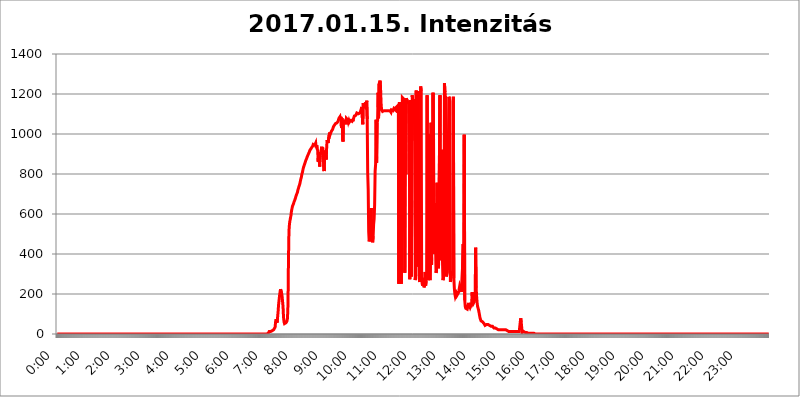
| Category | 2017.01.15. Intenzitás [W/m^2] |
|---|---|
| 0.0 | 0 |
| 0.0006944444444444445 | 0 |
| 0.001388888888888889 | 0 |
| 0.0020833333333333333 | 0 |
| 0.002777777777777778 | 0 |
| 0.003472222222222222 | 0 |
| 0.004166666666666667 | 0 |
| 0.004861111111111111 | 0 |
| 0.005555555555555556 | 0 |
| 0.0062499999999999995 | 0 |
| 0.006944444444444444 | 0 |
| 0.007638888888888889 | 0 |
| 0.008333333333333333 | 0 |
| 0.009027777777777779 | 0 |
| 0.009722222222222222 | 0 |
| 0.010416666666666666 | 0 |
| 0.011111111111111112 | 0 |
| 0.011805555555555555 | 0 |
| 0.012499999999999999 | 0 |
| 0.013194444444444444 | 0 |
| 0.013888888888888888 | 0 |
| 0.014583333333333332 | 0 |
| 0.015277777777777777 | 0 |
| 0.015972222222222224 | 0 |
| 0.016666666666666666 | 0 |
| 0.017361111111111112 | 0 |
| 0.018055555555555557 | 0 |
| 0.01875 | 0 |
| 0.019444444444444445 | 0 |
| 0.02013888888888889 | 0 |
| 0.020833333333333332 | 0 |
| 0.02152777777777778 | 0 |
| 0.022222222222222223 | 0 |
| 0.02291666666666667 | 0 |
| 0.02361111111111111 | 0 |
| 0.024305555555555556 | 0 |
| 0.024999999999999998 | 0 |
| 0.025694444444444447 | 0 |
| 0.02638888888888889 | 0 |
| 0.027083333333333334 | 0 |
| 0.027777777777777776 | 0 |
| 0.02847222222222222 | 0 |
| 0.029166666666666664 | 0 |
| 0.029861111111111113 | 0 |
| 0.030555555555555555 | 0 |
| 0.03125 | 0 |
| 0.03194444444444445 | 0 |
| 0.03263888888888889 | 0 |
| 0.03333333333333333 | 0 |
| 0.034027777777777775 | 0 |
| 0.034722222222222224 | 0 |
| 0.035416666666666666 | 0 |
| 0.036111111111111115 | 0 |
| 0.03680555555555556 | 0 |
| 0.0375 | 0 |
| 0.03819444444444444 | 0 |
| 0.03888888888888889 | 0 |
| 0.03958333333333333 | 0 |
| 0.04027777777777778 | 0 |
| 0.04097222222222222 | 0 |
| 0.041666666666666664 | 0 |
| 0.042361111111111106 | 0 |
| 0.04305555555555556 | 0 |
| 0.043750000000000004 | 0 |
| 0.044444444444444446 | 0 |
| 0.04513888888888889 | 0 |
| 0.04583333333333334 | 0 |
| 0.04652777777777778 | 0 |
| 0.04722222222222222 | 0 |
| 0.04791666666666666 | 0 |
| 0.04861111111111111 | 0 |
| 0.049305555555555554 | 0 |
| 0.049999999999999996 | 0 |
| 0.05069444444444445 | 0 |
| 0.051388888888888894 | 0 |
| 0.052083333333333336 | 0 |
| 0.05277777777777778 | 0 |
| 0.05347222222222222 | 0 |
| 0.05416666666666667 | 0 |
| 0.05486111111111111 | 0 |
| 0.05555555555555555 | 0 |
| 0.05625 | 0 |
| 0.05694444444444444 | 0 |
| 0.057638888888888885 | 0 |
| 0.05833333333333333 | 0 |
| 0.05902777777777778 | 0 |
| 0.059722222222222225 | 0 |
| 0.06041666666666667 | 0 |
| 0.061111111111111116 | 0 |
| 0.06180555555555556 | 0 |
| 0.0625 | 0 |
| 0.06319444444444444 | 0 |
| 0.06388888888888888 | 0 |
| 0.06458333333333334 | 0 |
| 0.06527777777777778 | 0 |
| 0.06597222222222222 | 0 |
| 0.06666666666666667 | 0 |
| 0.06736111111111111 | 0 |
| 0.06805555555555555 | 0 |
| 0.06874999999999999 | 0 |
| 0.06944444444444443 | 0 |
| 0.07013888888888889 | 0 |
| 0.07083333333333333 | 0 |
| 0.07152777777777779 | 0 |
| 0.07222222222222223 | 0 |
| 0.07291666666666667 | 0 |
| 0.07361111111111111 | 0 |
| 0.07430555555555556 | 0 |
| 0.075 | 0 |
| 0.07569444444444444 | 0 |
| 0.0763888888888889 | 0 |
| 0.07708333333333334 | 0 |
| 0.07777777777777778 | 0 |
| 0.07847222222222222 | 0 |
| 0.07916666666666666 | 0 |
| 0.0798611111111111 | 0 |
| 0.08055555555555556 | 0 |
| 0.08125 | 0 |
| 0.08194444444444444 | 0 |
| 0.08263888888888889 | 0 |
| 0.08333333333333333 | 0 |
| 0.08402777777777777 | 0 |
| 0.08472222222222221 | 0 |
| 0.08541666666666665 | 0 |
| 0.08611111111111112 | 0 |
| 0.08680555555555557 | 0 |
| 0.08750000000000001 | 0 |
| 0.08819444444444445 | 0 |
| 0.08888888888888889 | 0 |
| 0.08958333333333333 | 0 |
| 0.09027777777777778 | 0 |
| 0.09097222222222222 | 0 |
| 0.09166666666666667 | 0 |
| 0.09236111111111112 | 0 |
| 0.09305555555555556 | 0 |
| 0.09375 | 0 |
| 0.09444444444444444 | 0 |
| 0.09513888888888888 | 0 |
| 0.09583333333333333 | 0 |
| 0.09652777777777777 | 0 |
| 0.09722222222222222 | 0 |
| 0.09791666666666667 | 0 |
| 0.09861111111111111 | 0 |
| 0.09930555555555555 | 0 |
| 0.09999999999999999 | 0 |
| 0.10069444444444443 | 0 |
| 0.1013888888888889 | 0 |
| 0.10208333333333335 | 0 |
| 0.10277777777777779 | 0 |
| 0.10347222222222223 | 0 |
| 0.10416666666666667 | 0 |
| 0.10486111111111111 | 0 |
| 0.10555555555555556 | 0 |
| 0.10625 | 0 |
| 0.10694444444444444 | 0 |
| 0.1076388888888889 | 0 |
| 0.10833333333333334 | 0 |
| 0.10902777777777778 | 0 |
| 0.10972222222222222 | 0 |
| 0.1111111111111111 | 0 |
| 0.11180555555555556 | 0 |
| 0.11180555555555556 | 0 |
| 0.1125 | 0 |
| 0.11319444444444444 | 0 |
| 0.11388888888888889 | 0 |
| 0.11458333333333333 | 0 |
| 0.11527777777777777 | 0 |
| 0.11597222222222221 | 0 |
| 0.11666666666666665 | 0 |
| 0.1173611111111111 | 0 |
| 0.11805555555555557 | 0 |
| 0.11944444444444445 | 0 |
| 0.12013888888888889 | 0 |
| 0.12083333333333333 | 0 |
| 0.12152777777777778 | 0 |
| 0.12222222222222223 | 0 |
| 0.12291666666666667 | 0 |
| 0.12291666666666667 | 0 |
| 0.12361111111111112 | 0 |
| 0.12430555555555556 | 0 |
| 0.125 | 0 |
| 0.12569444444444444 | 0 |
| 0.12638888888888888 | 0 |
| 0.12708333333333333 | 0 |
| 0.16875 | 0 |
| 0.12847222222222224 | 0 |
| 0.12916666666666668 | 0 |
| 0.12986111111111112 | 0 |
| 0.13055555555555556 | 0 |
| 0.13125 | 0 |
| 0.13194444444444445 | 0 |
| 0.1326388888888889 | 0 |
| 0.13333333333333333 | 0 |
| 0.13402777777777777 | 0 |
| 0.13402777777777777 | 0 |
| 0.13472222222222222 | 0 |
| 0.13541666666666666 | 0 |
| 0.1361111111111111 | 0 |
| 0.13749999999999998 | 0 |
| 0.13819444444444443 | 0 |
| 0.1388888888888889 | 0 |
| 0.13958333333333334 | 0 |
| 0.14027777777777778 | 0 |
| 0.14097222222222222 | 0 |
| 0.14166666666666666 | 0 |
| 0.1423611111111111 | 0 |
| 0.14305555555555557 | 0 |
| 0.14375000000000002 | 0 |
| 0.14444444444444446 | 0 |
| 0.1451388888888889 | 0 |
| 0.1451388888888889 | 0 |
| 0.14652777777777778 | 0 |
| 0.14722222222222223 | 0 |
| 0.14791666666666667 | 0 |
| 0.1486111111111111 | 0 |
| 0.14930555555555555 | 0 |
| 0.15 | 0 |
| 0.15069444444444444 | 0 |
| 0.15138888888888888 | 0 |
| 0.15208333333333332 | 0 |
| 0.15277777777777776 | 0 |
| 0.15347222222222223 | 0 |
| 0.15416666666666667 | 0 |
| 0.15486111111111112 | 0 |
| 0.15555555555555556 | 0 |
| 0.15625 | 0 |
| 0.15694444444444444 | 0 |
| 0.15763888888888888 | 0 |
| 0.15833333333333333 | 0 |
| 0.15902777777777777 | 0 |
| 0.15972222222222224 | 0 |
| 0.16041666666666668 | 0 |
| 0.16111111111111112 | 0 |
| 0.16180555555555556 | 0 |
| 0.1625 | 0 |
| 0.16319444444444445 | 0 |
| 0.1638888888888889 | 0 |
| 0.16458333333333333 | 0 |
| 0.16527777777777777 | 0 |
| 0.16597222222222222 | 0 |
| 0.16666666666666666 | 0 |
| 0.1673611111111111 | 0 |
| 0.16805555555555554 | 0 |
| 0.16874999999999998 | 0 |
| 0.16944444444444443 | 0 |
| 0.17013888888888887 | 0 |
| 0.1708333333333333 | 0 |
| 0.17152777777777775 | 0 |
| 0.17222222222222225 | 0 |
| 0.1729166666666667 | 0 |
| 0.17361111111111113 | 0 |
| 0.17430555555555557 | 0 |
| 0.17500000000000002 | 0 |
| 0.17569444444444446 | 0 |
| 0.1763888888888889 | 0 |
| 0.17708333333333334 | 0 |
| 0.17777777777777778 | 0 |
| 0.17847222222222223 | 0 |
| 0.17916666666666667 | 0 |
| 0.1798611111111111 | 0 |
| 0.18055555555555555 | 0 |
| 0.18125 | 0 |
| 0.18194444444444444 | 0 |
| 0.1826388888888889 | 0 |
| 0.18333333333333335 | 0 |
| 0.1840277777777778 | 0 |
| 0.18472222222222223 | 0 |
| 0.18541666666666667 | 0 |
| 0.18611111111111112 | 0 |
| 0.18680555555555556 | 0 |
| 0.1875 | 0 |
| 0.18819444444444444 | 0 |
| 0.18888888888888888 | 0 |
| 0.18958333333333333 | 0 |
| 0.19027777777777777 | 0 |
| 0.1909722222222222 | 0 |
| 0.19166666666666665 | 0 |
| 0.19236111111111112 | 0 |
| 0.19305555555555554 | 0 |
| 0.19375 | 0 |
| 0.19444444444444445 | 0 |
| 0.1951388888888889 | 0 |
| 0.19583333333333333 | 0 |
| 0.19652777777777777 | 0 |
| 0.19722222222222222 | 0 |
| 0.19791666666666666 | 0 |
| 0.1986111111111111 | 0 |
| 0.19930555555555554 | 0 |
| 0.19999999999999998 | 0 |
| 0.20069444444444443 | 0 |
| 0.20138888888888887 | 0 |
| 0.2020833333333333 | 0 |
| 0.2027777777777778 | 0 |
| 0.2034722222222222 | 0 |
| 0.2041666666666667 | 0 |
| 0.20486111111111113 | 0 |
| 0.20555555555555557 | 0 |
| 0.20625000000000002 | 0 |
| 0.20694444444444446 | 0 |
| 0.2076388888888889 | 0 |
| 0.20833333333333334 | 0 |
| 0.20902777777777778 | 0 |
| 0.20972222222222223 | 0 |
| 0.21041666666666667 | 0 |
| 0.2111111111111111 | 0 |
| 0.21180555555555555 | 0 |
| 0.2125 | 0 |
| 0.21319444444444444 | 0 |
| 0.2138888888888889 | 0 |
| 0.21458333333333335 | 0 |
| 0.2152777777777778 | 0 |
| 0.21597222222222223 | 0 |
| 0.21666666666666667 | 0 |
| 0.21736111111111112 | 0 |
| 0.21805555555555556 | 0 |
| 0.21875 | 0 |
| 0.21944444444444444 | 0 |
| 0.22013888888888888 | 0 |
| 0.22083333333333333 | 0 |
| 0.22152777777777777 | 0 |
| 0.2222222222222222 | 0 |
| 0.22291666666666665 | 0 |
| 0.2236111111111111 | 0 |
| 0.22430555555555556 | 0 |
| 0.225 | 0 |
| 0.22569444444444445 | 0 |
| 0.2263888888888889 | 0 |
| 0.22708333333333333 | 0 |
| 0.22777777777777777 | 0 |
| 0.22847222222222222 | 0 |
| 0.22916666666666666 | 0 |
| 0.2298611111111111 | 0 |
| 0.23055555555555554 | 0 |
| 0.23124999999999998 | 0 |
| 0.23194444444444443 | 0 |
| 0.23263888888888887 | 0 |
| 0.2333333333333333 | 0 |
| 0.2340277777777778 | 0 |
| 0.2347222222222222 | 0 |
| 0.2354166666666667 | 0 |
| 0.23611111111111113 | 0 |
| 0.23680555555555557 | 0 |
| 0.23750000000000002 | 0 |
| 0.23819444444444446 | 0 |
| 0.2388888888888889 | 0 |
| 0.23958333333333334 | 0 |
| 0.24027777777777778 | 0 |
| 0.24097222222222223 | 0 |
| 0.24166666666666667 | 0 |
| 0.2423611111111111 | 0 |
| 0.24305555555555555 | 0 |
| 0.24375 | 0 |
| 0.24444444444444446 | 0 |
| 0.24513888888888888 | 0 |
| 0.24583333333333335 | 0 |
| 0.2465277777777778 | 0 |
| 0.24722222222222223 | 0 |
| 0.24791666666666667 | 0 |
| 0.24861111111111112 | 0 |
| 0.24930555555555556 | 0 |
| 0.25 | 0 |
| 0.25069444444444444 | 0 |
| 0.2513888888888889 | 0 |
| 0.2520833333333333 | 0 |
| 0.25277777777777777 | 0 |
| 0.2534722222222222 | 0 |
| 0.25416666666666665 | 0 |
| 0.2548611111111111 | 0 |
| 0.2555555555555556 | 0 |
| 0.25625000000000003 | 0 |
| 0.2569444444444445 | 0 |
| 0.2576388888888889 | 0 |
| 0.25833333333333336 | 0 |
| 0.2590277777777778 | 0 |
| 0.25972222222222224 | 0 |
| 0.2604166666666667 | 0 |
| 0.2611111111111111 | 0 |
| 0.26180555555555557 | 0 |
| 0.2625 | 0 |
| 0.26319444444444445 | 0 |
| 0.2638888888888889 | 0 |
| 0.26458333333333334 | 0 |
| 0.2652777777777778 | 0 |
| 0.2659722222222222 | 0 |
| 0.26666666666666666 | 0 |
| 0.2673611111111111 | 0 |
| 0.26805555555555555 | 0 |
| 0.26875 | 0 |
| 0.26944444444444443 | 0 |
| 0.2701388888888889 | 0 |
| 0.2708333333333333 | 0 |
| 0.27152777777777776 | 0 |
| 0.2722222222222222 | 0 |
| 0.27291666666666664 | 0 |
| 0.2736111111111111 | 0 |
| 0.2743055555555555 | 0 |
| 0.27499999999999997 | 0 |
| 0.27569444444444446 | 0 |
| 0.27638888888888885 | 0 |
| 0.27708333333333335 | 0 |
| 0.2777777777777778 | 0 |
| 0.27847222222222223 | 0 |
| 0.2791666666666667 | 0 |
| 0.2798611111111111 | 0 |
| 0.28055555555555556 | 0 |
| 0.28125 | 0 |
| 0.28194444444444444 | 0 |
| 0.2826388888888889 | 0 |
| 0.2833333333333333 | 0 |
| 0.28402777777777777 | 0 |
| 0.2847222222222222 | 0 |
| 0.28541666666666665 | 0 |
| 0.28611111111111115 | 0 |
| 0.28680555555555554 | 0 |
| 0.28750000000000003 | 0 |
| 0.2881944444444445 | 0 |
| 0.2888888888888889 | 0 |
| 0.28958333333333336 | 0 |
| 0.2902777777777778 | 0 |
| 0.29097222222222224 | 0 |
| 0.2916666666666667 | 0 |
| 0.2923611111111111 | 0 |
| 0.29305555555555557 | 0 |
| 0.29375 | 0 |
| 0.29444444444444445 | 3.525 |
| 0.2951388888888889 | 3.525 |
| 0.29583333333333334 | 3.525 |
| 0.2965277777777778 | 7.887 |
| 0.2972222222222222 | 12.257 |
| 0.29791666666666666 | 12.257 |
| 0.2986111111111111 | 12.257 |
| 0.29930555555555555 | 12.257 |
| 0.3 | 16.636 |
| 0.30069444444444443 | 16.636 |
| 0.3013888888888889 | 16.636 |
| 0.3020833333333333 | 21.024 |
| 0.30277777777777776 | 21.024 |
| 0.3034722222222222 | 21.024 |
| 0.30416666666666664 | 21.024 |
| 0.3048611111111111 | 21.024 |
| 0.3055555555555555 | 34.234 |
| 0.30624999999999997 | 60.85 |
| 0.3069444444444444 | 74.246 |
| 0.3076388888888889 | 65.31 |
| 0.30833333333333335 | 56.398 |
| 0.3090277777777778 | 83.205 |
| 0.30972222222222223 | 110.201 |
| 0.3104166666666667 | 146.423 |
| 0.3111111111111111 | 169.156 |
| 0.31180555555555556 | 191.937 |
| 0.3125 | 210.182 |
| 0.31319444444444444 | 223.873 |
| 0.3138888888888889 | 219.309 |
| 0.3145833333333333 | 205.62 |
| 0.31527777777777777 | 191.937 |
| 0.3159722222222222 | 196.497 |
| 0.31666666666666665 | 137.347 |
| 0.31736111111111115 | 83.205 |
| 0.31805555555555554 | 60.85 |
| 0.31875000000000003 | 51.951 |
| 0.3194444444444445 | 51.951 |
| 0.3201388888888889 | 51.951 |
| 0.32083333333333336 | 56.398 |
| 0.3215277777777778 | 60.85 |
| 0.32222222222222224 | 65.31 |
| 0.3229166666666667 | 78.722 |
| 0.3236111111111111 | 146.423 |
| 0.32430555555555557 | 373.729 |
| 0.325 | 515.223 |
| 0.32569444444444445 | 549.704 |
| 0.3263888888888889 | 566.793 |
| 0.32708333333333334 | 579.542 |
| 0.3277777777777778 | 592.233 |
| 0.3284722222222222 | 613.252 |
| 0.32916666666666666 | 625.784 |
| 0.3298611111111111 | 638.256 |
| 0.33055555555555555 | 642.4 |
| 0.33125 | 650.667 |
| 0.33194444444444443 | 658.909 |
| 0.3326388888888889 | 663.019 |
| 0.3333333333333333 | 671.22 |
| 0.3340277777777778 | 679.395 |
| 0.3347222222222222 | 687.544 |
| 0.3354166666666667 | 695.666 |
| 0.3361111111111111 | 699.717 |
| 0.3368055555555556 | 707.8 |
| 0.33749999999999997 | 719.877 |
| 0.33819444444444446 | 727.896 |
| 0.33888888888888885 | 735.89 |
| 0.33958333333333335 | 739.877 |
| 0.34027777777777773 | 751.803 |
| 0.34097222222222223 | 763.674 |
| 0.3416666666666666 | 775.492 |
| 0.3423611111111111 | 783.342 |
| 0.3430555555555555 | 798.974 |
| 0.34375 | 806.757 |
| 0.3444444444444445 | 818.392 |
| 0.3451388888888889 | 829.981 |
| 0.3458333333333334 | 837.682 |
| 0.34652777777777777 | 845.365 |
| 0.34722222222222227 | 853.029 |
| 0.34791666666666665 | 860.676 |
| 0.34861111111111115 | 868.305 |
| 0.34930555555555554 | 872.114 |
| 0.35000000000000003 | 879.719 |
| 0.3506944444444444 | 887.309 |
| 0.3513888888888889 | 891.099 |
| 0.3520833333333333 | 898.668 |
| 0.3527777777777778 | 902.447 |
| 0.3534722222222222 | 909.996 |
| 0.3541666666666667 | 917.534 |
| 0.3548611111111111 | 921.298 |
| 0.35555555555555557 | 925.06 |
| 0.35625 | 925.06 |
| 0.35694444444444445 | 932.576 |
| 0.3576388888888889 | 936.33 |
| 0.35833333333333334 | 940.082 |
| 0.3590277777777778 | 947.58 |
| 0.3597222222222222 | 943.832 |
| 0.36041666666666666 | 951.327 |
| 0.3611111111111111 | 943.832 |
| 0.36180555555555555 | 940.082 |
| 0.3625 | 955.071 |
| 0.36319444444444443 | 932.576 |
| 0.3638888888888889 | 943.832 |
| 0.3645833333333333 | 925.06 |
| 0.3652777777777778 | 917.534 |
| 0.3659722222222222 | 860.676 |
| 0.3666666666666667 | 909.996 |
| 0.3673611111111111 | 913.766 |
| 0.3680555555555556 | 837.682 |
| 0.36874999999999997 | 891.099 |
| 0.36944444444444446 | 887.309 |
| 0.37013888888888885 | 917.534 |
| 0.37083333333333335 | 936.33 |
| 0.37152777777777773 | 909.996 |
| 0.37222222222222223 | 932.576 |
| 0.3729166666666666 | 932.576 |
| 0.3736111111111111 | 932.576 |
| 0.3743055555555555 | 814.519 |
| 0.375 | 887.309 |
| 0.3756944444444445 | 894.885 |
| 0.3763888888888889 | 917.534 |
| 0.3770833333333334 | 872.114 |
| 0.37777777777777777 | 925.06 |
| 0.37847222222222227 | 970.034 |
| 0.37916666666666665 | 966.295 |
| 0.37986111111111115 | 955.071 |
| 0.38055555555555554 | 958.814 |
| 0.38125000000000003 | 992.448 |
| 0.3819444444444444 | 1007.383 |
| 0.3826388888888889 | 996.182 |
| 0.3833333333333333 | 1003.65 |
| 0.3840277777777778 | 1007.383 |
| 0.3847222222222222 | 1014.852 |
| 0.3854166666666667 | 1014.852 |
| 0.3861111111111111 | 1022.323 |
| 0.38680555555555557 | 1029.798 |
| 0.3875 | 1037.277 |
| 0.38819444444444445 | 1041.019 |
| 0.3888888888888889 | 1044.762 |
| 0.38958333333333334 | 1041.019 |
| 0.3902777777777778 | 1052.255 |
| 0.3909722222222222 | 1052.255 |
| 0.39166666666666666 | 1052.255 |
| 0.3923611111111111 | 1056.004 |
| 0.39305555555555555 | 1059.756 |
| 0.39375 | 1063.51 |
| 0.39444444444444443 | 1071.027 |
| 0.3951388888888889 | 1078.555 |
| 0.3958333333333333 | 1078.555 |
| 0.3965277777777778 | 1086.097 |
| 0.3972222222222222 | 1071.027 |
| 0.3979166666666667 | 1086.097 |
| 0.3986111111111111 | 1029.798 |
| 0.3993055555555556 | 1078.555 |
| 0.39999999999999997 | 1078.555 |
| 0.40069444444444446 | 962.555 |
| 0.40138888888888885 | 1063.51 |
| 0.40208333333333335 | 1059.756 |
| 0.40277777777777773 | 1059.756 |
| 0.40347222222222223 | 1063.51 |
| 0.4041666666666666 | 1071.027 |
| 0.4048611111111111 | 1048.508 |
| 0.4055555555555555 | 1078.555 |
| 0.40625 | 1074.789 |
| 0.4069444444444445 | 1074.789 |
| 0.4076388888888889 | 1071.027 |
| 0.4083333333333334 | 1059.756 |
| 0.40902777777777777 | 1067.267 |
| 0.40972222222222227 | 1059.756 |
| 0.41041666666666665 | 1056.004 |
| 0.41111111111111115 | 1067.267 |
| 0.41180555555555554 | 1067.267 |
| 0.41250000000000003 | 1071.027 |
| 0.4131944444444444 | 1063.51 |
| 0.4138888888888889 | 1074.789 |
| 0.4145833333333333 | 1063.51 |
| 0.4152777777777778 | 1074.789 |
| 0.4159722222222222 | 1078.555 |
| 0.4166666666666667 | 1089.873 |
| 0.4173611111111111 | 1093.653 |
| 0.41805555555555557 | 1089.873 |
| 0.41875 | 1093.653 |
| 0.41944444444444445 | 1093.653 |
| 0.4201388888888889 | 1105.019 |
| 0.42083333333333334 | 1101.226 |
| 0.4215277777777778 | 1101.226 |
| 0.4222222222222222 | 1101.226 |
| 0.42291666666666666 | 1101.226 |
| 0.4236111111111111 | 1101.226 |
| 0.42430555555555555 | 1105.019 |
| 0.425 | 1105.019 |
| 0.42569444444444443 | 1116.426 |
| 0.4263888888888889 | 1120.238 |
| 0.4270833333333333 | 1135.543 |
| 0.4277777777777778 | 1139.384 |
| 0.4284722222222222 | 1048.508 |
| 0.4291666666666667 | 1154.814 |
| 0.4298611111111111 | 1158.689 |
| 0.4305555555555556 | 1150.946 |
| 0.43124999999999997 | 1131.708 |
| 0.43194444444444446 | 1143.232 |
| 0.43263888888888885 | 1158.689 |
| 0.43333333333333335 | 1124.056 |
| 0.43402777777777773 | 1166.46 |
| 0.43472222222222223 | 1074.789 |
| 0.4354166666666666 | 806.757 |
| 0.4361111111111111 | 723.889 |
| 0.4368055555555555 | 510.885 |
| 0.4375 | 462.786 |
| 0.4381944444444445 | 458.38 |
| 0.4388888888888889 | 458.38 |
| 0.4395833333333334 | 493.475 |
| 0.44027777777777777 | 629.948 |
| 0.44097222222222227 | 497.836 |
| 0.44166666666666665 | 471.582 |
| 0.44236111111111115 | 458.38 |
| 0.44305555555555554 | 489.108 |
| 0.44375000000000003 | 549.704 |
| 0.4444444444444444 | 575.299 |
| 0.4451388888888889 | 646.537 |
| 0.4458333333333333 | 814.519 |
| 0.4465277777777778 | 849.199 |
| 0.4472222222222222 | 1071.027 |
| 0.4479166666666667 | 856.855 |
| 0.4486111111111111 | 1056.004 |
| 0.44930555555555557 | 1067.267 |
| 0.45 | 1205.82 |
| 0.45069444444444445 | 1078.555 |
| 0.4513888888888889 | 1250.275 |
| 0.45208333333333334 | 1258.511 |
| 0.4527777777777778 | 1266.8 |
| 0.4534722222222222 | 1225.859 |
| 0.45416666666666666 | 1154.814 |
| 0.4548611111111111 | 1120.238 |
| 0.45555555555555555 | 1116.426 |
| 0.45625 | 1112.618 |
| 0.45694444444444443 | 1116.426 |
| 0.4576388888888889 | 1116.426 |
| 0.4583333333333333 | 1116.426 |
| 0.4590277777777778 | 1116.426 |
| 0.4597222222222222 | 1116.426 |
| 0.4604166666666667 | 1116.426 |
| 0.4611111111111111 | 1116.426 |
| 0.4618055555555556 | 1116.426 |
| 0.46249999999999997 | 1116.426 |
| 0.46319444444444446 | 1112.618 |
| 0.46388888888888885 | 1116.426 |
| 0.46458333333333335 | 1116.426 |
| 0.46527777777777773 | 1112.618 |
| 0.46597222222222223 | 1120.238 |
| 0.4666666666666666 | 1116.426 |
| 0.4673611111111111 | 1116.426 |
| 0.4680555555555555 | 1108.816 |
| 0.46875 | 1120.238 |
| 0.4694444444444445 | 1124.056 |
| 0.4701388888888889 | 1116.426 |
| 0.4708333333333334 | 1116.426 |
| 0.47152777777777777 | 1120.238 |
| 0.47222222222222227 | 1127.879 |
| 0.47291666666666665 | 1124.056 |
| 0.47361111111111115 | 1124.056 |
| 0.47430555555555554 | 1120.238 |
| 0.47500000000000003 | 1131.708 |
| 0.4756944444444444 | 1127.879 |
| 0.4763888888888889 | 1131.708 |
| 0.4770833333333333 | 1139.384 |
| 0.4777777777777778 | 1105.019 |
| 0.4784722222222222 | 1135.543 |
| 0.4791666666666667 | 251.251 |
| 0.4798611111111111 | 1158.689 |
| 0.48055555555555557 | 1135.543 |
| 0.48125 | 1147.086 |
| 0.48194444444444445 | 269.49 |
| 0.4826388888888889 | 251.251 |
| 0.48333333333333334 | 695.666 |
| 0.4840277777777778 | 1182.099 |
| 0.4847222222222222 | 1182.099 |
| 0.48541666666666666 | 1182.099 |
| 0.4861111111111111 | 1174.263 |
| 0.48680555555555555 | 1033.537 |
| 0.4875 | 305.898 |
| 0.48819444444444443 | 1124.056 |
| 0.4888888888888889 | 798.974 |
| 0.4895833333333333 | 1178.177 |
| 0.4902777777777778 | 1178.177 |
| 0.4909722222222222 | 1174.263 |
| 0.4916666666666667 | 1158.689 |
| 0.4923611111111111 | 1162.571 |
| 0.4930555555555556 | 1158.689 |
| 0.49374999999999997 | 1158.689 |
| 0.49444444444444446 | 274.047 |
| 0.49513888888888885 | 699.717 |
| 0.49583333333333335 | 1170.358 |
| 0.49652777777777773 | 287.709 |
| 0.49722222222222223 | 667.123 |
| 0.4979166666666666 | 1193.918 |
| 0.4986111111111111 | 1189.969 |
| 0.4993055555555555 | 1116.426 |
| 0.5 | 1147.086 |
| 0.5006944444444444 | 1174.263 |
| 0.5013888888888889 | 966.295 |
| 0.5020833333333333 | 269.49 |
| 0.5027777777777778 | 296.808 |
| 0.5034722222222222 | 1217.812 |
| 0.5041666666666667 | 337.639 |
| 0.5048611111111111 | 431.833 |
| 0.5055555555555555 | 351.198 |
| 0.50625 | 1213.804 |
| 0.5069444444444444 | 962.555 |
| 0.5076388888888889 | 278.603 |
| 0.5083333333333333 | 260.373 |
| 0.5090277777777777 | 333.113 |
| 0.5097222222222222 | 1238.014 |
| 0.5104166666666666 | 1213.804 |
| 0.5111111111111112 | 274.047 |
| 0.5118055555555555 | 251.251 |
| 0.5125000000000001 | 242.127 |
| 0.5131944444444444 | 278.603 |
| 0.513888888888889 | 260.373 |
| 0.5145833333333333 | 233 |
| 0.5152777777777778 | 260.373 |
| 0.5159722222222222 | 310.44 |
| 0.5166666666666667 | 242.127 |
| 0.517361111111111 | 264.932 |
| 0.5180555555555556 | 292.259 |
| 0.5187499999999999 | 1193.918 |
| 0.5194444444444445 | 287.709 |
| 0.5201388888888888 | 269.49 |
| 0.5208333333333334 | 278.603 |
| 0.5215277777777778 | 999.916 |
| 0.5222222222222223 | 283.156 |
| 0.5229166666666667 | 269.49 |
| 0.5236111111111111 | 422.943 |
| 0.5243055555555556 | 1056.004 |
| 0.525 | 346.682 |
| 0.5256944444444445 | 747.834 |
| 0.5263888888888889 | 719.877 |
| 0.5270833333333333 | 1205.82 |
| 0.5277777777777778 | 970.034 |
| 0.5284722222222222 | 453.968 |
| 0.5291666666666667 | 400.638 |
| 0.5298611111111111 | 654.791 |
| 0.5305555555555556 | 449.551 |
| 0.53125 | 305.898 |
| 0.5319444444444444 | 314.98 |
| 0.5326388888888889 | 755.766 |
| 0.5333333333333333 | 342.162 |
| 0.5340277777777778 | 351.198 |
| 0.5347222222222222 | 328.584 |
| 0.5354166666666667 | 328.584 |
| 0.5361111111111111 | 333.113 |
| 0.5368055555555555 | 1193.918 |
| 0.5375 | 369.23 |
| 0.5381944444444444 | 396.164 |
| 0.5388888888888889 | 921.298 |
| 0.5395833333333333 | 405.108 |
| 0.5402777777777777 | 369.23 |
| 0.5409722222222222 | 269.49 |
| 0.5416666666666666 | 278.603 |
| 0.5423611111111112 | 328.584 |
| 0.5430555555555555 | 1254.387 |
| 0.5437500000000001 | 1209.807 |
| 0.5444444444444444 | 1189.969 |
| 0.545138888888889 | 1174.263 |
| 0.5458333333333333 | 287.709 |
| 0.5465277777777778 | 287.709 |
| 0.5472222222222222 | 314.98 |
| 0.5479166666666667 | 364.728 |
| 0.548611111111111 | 962.555 |
| 0.5493055555555556 | 1186.03 |
| 0.5499999999999999 | 1178.177 |
| 0.5506944444444445 | 1162.571 |
| 0.5513888888888888 | 260.373 |
| 0.5520833333333334 | 274.047 |
| 0.5527777777777778 | 314.98 |
| 0.5534722222222223 | 305.898 |
| 0.5541666666666667 | 292.259 |
| 0.5548611111111111 | 305.898 |
| 0.5555555555555556 | 1186.03 |
| 0.55625 | 278.603 |
| 0.5569444444444445 | 228.436 |
| 0.5576388888888889 | 201.058 |
| 0.5583333333333333 | 187.378 |
| 0.5590277777777778 | 182.82 |
| 0.5597222222222222 | 201.058 |
| 0.5604166666666667 | 191.937 |
| 0.5611111111111111 | 187.378 |
| 0.5618055555555556 | 191.937 |
| 0.5625 | 205.62 |
| 0.5631944444444444 | 214.746 |
| 0.5638888888888889 | 228.436 |
| 0.5645833333333333 | 242.127 |
| 0.5652777777777778 | 237.564 |
| 0.5659722222222222 | 228.436 |
| 0.5666666666666667 | 219.309 |
| 0.5673611111111111 | 210.182 |
| 0.5680555555555555 | 205.62 |
| 0.56875 | 210.182 |
| 0.5694444444444444 | 449.551 |
| 0.5701388888888889 | 214.746 |
| 0.5708333333333333 | 996.182 |
| 0.5715277777777777 | 169.156 |
| 0.5722222222222222 | 137.347 |
| 0.5729166666666666 | 128.284 |
| 0.5736111111111112 | 128.284 |
| 0.5743055555555555 | 128.284 |
| 0.5750000000000001 | 123.758 |
| 0.5756944444444444 | 119.235 |
| 0.576388888888889 | 119.235 |
| 0.5770833333333333 | 155.509 |
| 0.5777777777777778 | 146.423 |
| 0.5784722222222222 | 146.423 |
| 0.5791666666666667 | 132.814 |
| 0.579861111111111 | 132.814 |
| 0.5805555555555556 | 132.814 |
| 0.5812499999999999 | 150.964 |
| 0.5819444444444445 | 210.182 |
| 0.5826388888888888 | 160.056 |
| 0.5833333333333334 | 150.964 |
| 0.5840277777777778 | 150.964 |
| 0.5847222222222223 | 160.056 |
| 0.5854166666666667 | 164.605 |
| 0.5861111111111111 | 178.264 |
| 0.5868055555555556 | 431.833 |
| 0.5875 | 233 |
| 0.5881944444444445 | 187.378 |
| 0.5888888888888889 | 155.509 |
| 0.5895833333333333 | 137.347 |
| 0.5902777777777778 | 137.347 |
| 0.5909722222222222 | 119.235 |
| 0.5916666666666667 | 105.69 |
| 0.5923611111111111 | 92.184 |
| 0.5930555555555556 | 78.722 |
| 0.59375 | 74.246 |
| 0.5944444444444444 | 65.31 |
| 0.5951388888888889 | 60.85 |
| 0.5958333333333333 | 65.31 |
| 0.5965277777777778 | 60.85 |
| 0.5972222222222222 | 65.31 |
| 0.5979166666666667 | 60.85 |
| 0.5986111111111111 | 51.951 |
| 0.5993055555555555 | 47.511 |
| 0.6 | 43.079 |
| 0.6006944444444444 | 43.079 |
| 0.6013888888888889 | 43.079 |
| 0.6020833333333333 | 47.511 |
| 0.6027777777777777 | 47.511 |
| 0.6034722222222222 | 47.511 |
| 0.6041666666666666 | 47.511 |
| 0.6048611111111112 | 47.511 |
| 0.6055555555555555 | 43.079 |
| 0.6062500000000001 | 43.079 |
| 0.6069444444444444 | 43.079 |
| 0.607638888888889 | 43.079 |
| 0.6083333333333333 | 38.653 |
| 0.6090277777777778 | 38.653 |
| 0.6097222222222222 | 38.653 |
| 0.6104166666666667 | 38.653 |
| 0.611111111111111 | 34.234 |
| 0.6118055555555556 | 34.234 |
| 0.6124999999999999 | 29.823 |
| 0.6131944444444445 | 29.823 |
| 0.6138888888888888 | 29.823 |
| 0.6145833333333334 | 29.823 |
| 0.6152777777777778 | 25.419 |
| 0.6159722222222223 | 25.419 |
| 0.6166666666666667 | 25.419 |
| 0.6173611111111111 | 21.024 |
| 0.6180555555555556 | 21.024 |
| 0.61875 | 21.024 |
| 0.6194444444444445 | 21.024 |
| 0.6201388888888889 | 21.024 |
| 0.6208333333333333 | 21.024 |
| 0.6215277777777778 | 21.024 |
| 0.6222222222222222 | 21.024 |
| 0.6229166666666667 | 21.024 |
| 0.6236111111111111 | 21.024 |
| 0.6243055555555556 | 21.024 |
| 0.625 | 21.024 |
| 0.6256944444444444 | 21.024 |
| 0.6263888888888889 | 21.024 |
| 0.6270833333333333 | 21.024 |
| 0.6277777777777778 | 21.024 |
| 0.6284722222222222 | 21.024 |
| 0.6291666666666667 | 21.024 |
| 0.6298611111111111 | 16.636 |
| 0.6305555555555555 | 16.636 |
| 0.63125 | 16.636 |
| 0.6319444444444444 | 12.257 |
| 0.6326388888888889 | 12.257 |
| 0.6333333333333333 | 12.257 |
| 0.6340277777777777 | 12.257 |
| 0.6347222222222222 | 12.257 |
| 0.6354166666666666 | 12.257 |
| 0.6361111111111112 | 12.257 |
| 0.6368055555555555 | 12.257 |
| 0.6375000000000001 | 12.257 |
| 0.6381944444444444 | 12.257 |
| 0.638888888888889 | 12.257 |
| 0.6395833333333333 | 12.257 |
| 0.6402777777777778 | 12.257 |
| 0.6409722222222222 | 12.257 |
| 0.6416666666666667 | 12.257 |
| 0.642361111111111 | 12.257 |
| 0.6430555555555556 | 12.257 |
| 0.6437499999999999 | 12.257 |
| 0.6444444444444445 | 12.257 |
| 0.6451388888888888 | 12.257 |
| 0.6458333333333334 | 12.257 |
| 0.6465277777777778 | 12.257 |
| 0.6472222222222223 | 12.257 |
| 0.6479166666666667 | 12.257 |
| 0.6486111111111111 | 12.257 |
| 0.6493055555555556 | 12.257 |
| 0.65 | 78.722 |
| 0.6506944444444445 | 60.85 |
| 0.6513888888888889 | 34.234 |
| 0.6520833333333333 | 7.887 |
| 0.6527777777777778 | 12.257 |
| 0.6534722222222222 | 12.257 |
| 0.6541666666666667 | 12.257 |
| 0.6548611111111111 | 12.257 |
| 0.6555555555555556 | 12.257 |
| 0.65625 | 7.887 |
| 0.6569444444444444 | 7.887 |
| 0.6576388888888889 | 7.887 |
| 0.6583333333333333 | 7.887 |
| 0.6590277777777778 | 7.887 |
| 0.6597222222222222 | 3.525 |
| 0.6604166666666667 | 3.525 |
| 0.6611111111111111 | 3.525 |
| 0.6618055555555555 | 3.525 |
| 0.6625 | 3.525 |
| 0.6631944444444444 | 3.525 |
| 0.6638888888888889 | 3.525 |
| 0.6645833333333333 | 3.525 |
| 0.6652777777777777 | 3.525 |
| 0.6659722222222222 | 3.525 |
| 0.6666666666666666 | 3.525 |
| 0.6673611111111111 | 3.525 |
| 0.6680555555555556 | 3.525 |
| 0.6687500000000001 | 3.525 |
| 0.6694444444444444 | 3.525 |
| 0.6701388888888888 | 3.525 |
| 0.6708333333333334 | 0 |
| 0.6715277777777778 | 3.525 |
| 0.6722222222222222 | 0 |
| 0.6729166666666666 | 0 |
| 0.6736111111111112 | 0 |
| 0.6743055555555556 | 0 |
| 0.6749999999999999 | 0 |
| 0.6756944444444444 | 0 |
| 0.6763888888888889 | 0 |
| 0.6770833333333334 | 0 |
| 0.6777777777777777 | 0 |
| 0.6784722222222223 | 0 |
| 0.6791666666666667 | 0 |
| 0.6798611111111111 | 0 |
| 0.6805555555555555 | 0 |
| 0.68125 | 0 |
| 0.6819444444444445 | 0 |
| 0.6826388888888889 | 0 |
| 0.6833333333333332 | 0 |
| 0.6840277777777778 | 0 |
| 0.6847222222222222 | 0 |
| 0.6854166666666667 | 0 |
| 0.686111111111111 | 0 |
| 0.6868055555555556 | 0 |
| 0.6875 | 0 |
| 0.6881944444444444 | 0 |
| 0.688888888888889 | 0 |
| 0.6895833333333333 | 0 |
| 0.6902777777777778 | 0 |
| 0.6909722222222222 | 0 |
| 0.6916666666666668 | 0 |
| 0.6923611111111111 | 0 |
| 0.6930555555555555 | 0 |
| 0.69375 | 0 |
| 0.6944444444444445 | 0 |
| 0.6951388888888889 | 0 |
| 0.6958333333333333 | 0 |
| 0.6965277777777777 | 0 |
| 0.6972222222222223 | 0 |
| 0.6979166666666666 | 0 |
| 0.6986111111111111 | 0 |
| 0.6993055555555556 | 0 |
| 0.7000000000000001 | 0 |
| 0.7006944444444444 | 0 |
| 0.7013888888888888 | 0 |
| 0.7020833333333334 | 0 |
| 0.7027777777777778 | 0 |
| 0.7034722222222222 | 0 |
| 0.7041666666666666 | 0 |
| 0.7048611111111112 | 0 |
| 0.7055555555555556 | 0 |
| 0.7062499999999999 | 0 |
| 0.7069444444444444 | 0 |
| 0.7076388888888889 | 0 |
| 0.7083333333333334 | 0 |
| 0.7090277777777777 | 0 |
| 0.7097222222222223 | 0 |
| 0.7104166666666667 | 0 |
| 0.7111111111111111 | 0 |
| 0.7118055555555555 | 0 |
| 0.7125 | 0 |
| 0.7131944444444445 | 0 |
| 0.7138888888888889 | 0 |
| 0.7145833333333332 | 0 |
| 0.7152777777777778 | 0 |
| 0.7159722222222222 | 0 |
| 0.7166666666666667 | 0 |
| 0.717361111111111 | 0 |
| 0.7180555555555556 | 0 |
| 0.71875 | 0 |
| 0.7194444444444444 | 0 |
| 0.720138888888889 | 0 |
| 0.7208333333333333 | 0 |
| 0.7215277777777778 | 0 |
| 0.7222222222222222 | 0 |
| 0.7229166666666668 | 0 |
| 0.7236111111111111 | 0 |
| 0.7243055555555555 | 0 |
| 0.725 | 0 |
| 0.7256944444444445 | 0 |
| 0.7263888888888889 | 0 |
| 0.7270833333333333 | 0 |
| 0.7277777777777777 | 0 |
| 0.7284722222222223 | 0 |
| 0.7291666666666666 | 0 |
| 0.7298611111111111 | 0 |
| 0.7305555555555556 | 0 |
| 0.7312500000000001 | 0 |
| 0.7319444444444444 | 0 |
| 0.7326388888888888 | 0 |
| 0.7333333333333334 | 0 |
| 0.7340277777777778 | 0 |
| 0.7347222222222222 | 0 |
| 0.7354166666666666 | 0 |
| 0.7361111111111112 | 0 |
| 0.7368055555555556 | 0 |
| 0.7374999999999999 | 0 |
| 0.7381944444444444 | 0 |
| 0.7388888888888889 | 0 |
| 0.7395833333333334 | 0 |
| 0.7402777777777777 | 0 |
| 0.7409722222222223 | 0 |
| 0.7416666666666667 | 0 |
| 0.7423611111111111 | 0 |
| 0.7430555555555555 | 0 |
| 0.74375 | 0 |
| 0.7444444444444445 | 0 |
| 0.7451388888888889 | 0 |
| 0.7458333333333332 | 0 |
| 0.7465277777777778 | 0 |
| 0.7472222222222222 | 0 |
| 0.7479166666666667 | 0 |
| 0.748611111111111 | 0 |
| 0.7493055555555556 | 0 |
| 0.75 | 0 |
| 0.7506944444444444 | 0 |
| 0.751388888888889 | 0 |
| 0.7520833333333333 | 0 |
| 0.7527777777777778 | 0 |
| 0.7534722222222222 | 0 |
| 0.7541666666666668 | 0 |
| 0.7548611111111111 | 0 |
| 0.7555555555555555 | 0 |
| 0.75625 | 0 |
| 0.7569444444444445 | 0 |
| 0.7576388888888889 | 0 |
| 0.7583333333333333 | 0 |
| 0.7590277777777777 | 0 |
| 0.7597222222222223 | 0 |
| 0.7604166666666666 | 0 |
| 0.7611111111111111 | 0 |
| 0.7618055555555556 | 0 |
| 0.7625000000000001 | 0 |
| 0.7631944444444444 | 0 |
| 0.7638888888888888 | 0 |
| 0.7645833333333334 | 0 |
| 0.7652777777777778 | 0 |
| 0.7659722222222222 | 0 |
| 0.7666666666666666 | 0 |
| 0.7673611111111112 | 0 |
| 0.7680555555555556 | 0 |
| 0.7687499999999999 | 0 |
| 0.7694444444444444 | 0 |
| 0.7701388888888889 | 0 |
| 0.7708333333333334 | 0 |
| 0.7715277777777777 | 0 |
| 0.7722222222222223 | 0 |
| 0.7729166666666667 | 0 |
| 0.7736111111111111 | 0 |
| 0.7743055555555555 | 0 |
| 0.775 | 0 |
| 0.7756944444444445 | 0 |
| 0.7763888888888889 | 0 |
| 0.7770833333333332 | 0 |
| 0.7777777777777778 | 0 |
| 0.7784722222222222 | 0 |
| 0.7791666666666667 | 0 |
| 0.779861111111111 | 0 |
| 0.7805555555555556 | 0 |
| 0.78125 | 0 |
| 0.7819444444444444 | 0 |
| 0.782638888888889 | 0 |
| 0.7833333333333333 | 0 |
| 0.7840277777777778 | 0 |
| 0.7847222222222222 | 0 |
| 0.7854166666666668 | 0 |
| 0.7861111111111111 | 0 |
| 0.7868055555555555 | 0 |
| 0.7875 | 0 |
| 0.7881944444444445 | 0 |
| 0.7888888888888889 | 0 |
| 0.7895833333333333 | 0 |
| 0.7902777777777777 | 0 |
| 0.7909722222222223 | 0 |
| 0.7916666666666666 | 0 |
| 0.7923611111111111 | 0 |
| 0.7930555555555556 | 0 |
| 0.7937500000000001 | 0 |
| 0.7944444444444444 | 0 |
| 0.7951388888888888 | 0 |
| 0.7958333333333334 | 0 |
| 0.7965277777777778 | 0 |
| 0.7972222222222222 | 0 |
| 0.7979166666666666 | 0 |
| 0.7986111111111112 | 0 |
| 0.7993055555555556 | 0 |
| 0.7999999999999999 | 0 |
| 0.8006944444444444 | 0 |
| 0.8013888888888889 | 0 |
| 0.8020833333333334 | 0 |
| 0.8027777777777777 | 0 |
| 0.8034722222222223 | 0 |
| 0.8041666666666667 | 0 |
| 0.8048611111111111 | 0 |
| 0.8055555555555555 | 0 |
| 0.80625 | 0 |
| 0.8069444444444445 | 0 |
| 0.8076388888888889 | 0 |
| 0.8083333333333332 | 0 |
| 0.8090277777777778 | 0 |
| 0.8097222222222222 | 0 |
| 0.8104166666666667 | 0 |
| 0.811111111111111 | 0 |
| 0.8118055555555556 | 0 |
| 0.8125 | 0 |
| 0.8131944444444444 | 0 |
| 0.813888888888889 | 0 |
| 0.8145833333333333 | 0 |
| 0.8152777777777778 | 0 |
| 0.8159722222222222 | 0 |
| 0.8166666666666668 | 0 |
| 0.8173611111111111 | 0 |
| 0.8180555555555555 | 0 |
| 0.81875 | 0 |
| 0.8194444444444445 | 0 |
| 0.8201388888888889 | 0 |
| 0.8208333333333333 | 0 |
| 0.8215277777777777 | 0 |
| 0.8222222222222223 | 0 |
| 0.8229166666666666 | 0 |
| 0.8236111111111111 | 0 |
| 0.8243055555555556 | 0 |
| 0.8250000000000001 | 0 |
| 0.8256944444444444 | 0 |
| 0.8263888888888888 | 0 |
| 0.8270833333333334 | 0 |
| 0.8277777777777778 | 0 |
| 0.8284722222222222 | 0 |
| 0.8291666666666666 | 0 |
| 0.8298611111111112 | 0 |
| 0.8305555555555556 | 0 |
| 0.8312499999999999 | 0 |
| 0.8319444444444444 | 0 |
| 0.8326388888888889 | 0 |
| 0.8333333333333334 | 0 |
| 0.8340277777777777 | 0 |
| 0.8347222222222223 | 0 |
| 0.8354166666666667 | 0 |
| 0.8361111111111111 | 0 |
| 0.8368055555555555 | 0 |
| 0.8375 | 0 |
| 0.8381944444444445 | 0 |
| 0.8388888888888889 | 0 |
| 0.8395833333333332 | 0 |
| 0.8402777777777778 | 0 |
| 0.8409722222222222 | 0 |
| 0.8416666666666667 | 0 |
| 0.842361111111111 | 0 |
| 0.8430555555555556 | 0 |
| 0.84375 | 0 |
| 0.8444444444444444 | 0 |
| 0.845138888888889 | 0 |
| 0.8458333333333333 | 0 |
| 0.8465277777777778 | 0 |
| 0.8472222222222222 | 0 |
| 0.8479166666666668 | 0 |
| 0.8486111111111111 | 0 |
| 0.8493055555555555 | 0 |
| 0.85 | 0 |
| 0.8506944444444445 | 0 |
| 0.8513888888888889 | 0 |
| 0.8520833333333333 | 0 |
| 0.8527777777777777 | 0 |
| 0.8534722222222223 | 0 |
| 0.8541666666666666 | 0 |
| 0.8548611111111111 | 0 |
| 0.8555555555555556 | 0 |
| 0.8562500000000001 | 0 |
| 0.8569444444444444 | 0 |
| 0.8576388888888888 | 0 |
| 0.8583333333333334 | 0 |
| 0.8590277777777778 | 0 |
| 0.8597222222222222 | 0 |
| 0.8604166666666666 | 0 |
| 0.8611111111111112 | 0 |
| 0.8618055555555556 | 0 |
| 0.8624999999999999 | 0 |
| 0.8631944444444444 | 0 |
| 0.8638888888888889 | 0 |
| 0.8645833333333334 | 0 |
| 0.8652777777777777 | 0 |
| 0.8659722222222223 | 0 |
| 0.8666666666666667 | 0 |
| 0.8673611111111111 | 0 |
| 0.8680555555555555 | 0 |
| 0.86875 | 0 |
| 0.8694444444444445 | 0 |
| 0.8701388888888889 | 0 |
| 0.8708333333333332 | 0 |
| 0.8715277777777778 | 0 |
| 0.8722222222222222 | 0 |
| 0.8729166666666667 | 0 |
| 0.873611111111111 | 0 |
| 0.8743055555555556 | 0 |
| 0.875 | 0 |
| 0.8756944444444444 | 0 |
| 0.876388888888889 | 0 |
| 0.8770833333333333 | 0 |
| 0.8777777777777778 | 0 |
| 0.8784722222222222 | 0 |
| 0.8791666666666668 | 0 |
| 0.8798611111111111 | 0 |
| 0.8805555555555555 | 0 |
| 0.88125 | 0 |
| 0.8819444444444445 | 0 |
| 0.8826388888888889 | 0 |
| 0.8833333333333333 | 0 |
| 0.8840277777777777 | 0 |
| 0.8847222222222223 | 0 |
| 0.8854166666666666 | 0 |
| 0.8861111111111111 | 0 |
| 0.8868055555555556 | 0 |
| 0.8875000000000001 | 0 |
| 0.8881944444444444 | 0 |
| 0.8888888888888888 | 0 |
| 0.8895833333333334 | 0 |
| 0.8902777777777778 | 0 |
| 0.8909722222222222 | 0 |
| 0.8916666666666666 | 0 |
| 0.8923611111111112 | 0 |
| 0.8930555555555556 | 0 |
| 0.8937499999999999 | 0 |
| 0.8944444444444444 | 0 |
| 0.8951388888888889 | 0 |
| 0.8958333333333334 | 0 |
| 0.8965277777777777 | 0 |
| 0.8972222222222223 | 0 |
| 0.8979166666666667 | 0 |
| 0.8986111111111111 | 0 |
| 0.8993055555555555 | 0 |
| 0.9 | 0 |
| 0.9006944444444445 | 0 |
| 0.9013888888888889 | 0 |
| 0.9020833333333332 | 0 |
| 0.9027777777777778 | 0 |
| 0.9034722222222222 | 0 |
| 0.9041666666666667 | 0 |
| 0.904861111111111 | 0 |
| 0.9055555555555556 | 0 |
| 0.90625 | 0 |
| 0.9069444444444444 | 0 |
| 0.907638888888889 | 0 |
| 0.9083333333333333 | 0 |
| 0.9090277777777778 | 0 |
| 0.9097222222222222 | 0 |
| 0.9104166666666668 | 0 |
| 0.9111111111111111 | 0 |
| 0.9118055555555555 | 0 |
| 0.9125 | 0 |
| 0.9131944444444445 | 0 |
| 0.9138888888888889 | 0 |
| 0.9145833333333333 | 0 |
| 0.9152777777777777 | 0 |
| 0.9159722222222223 | 0 |
| 0.9166666666666666 | 0 |
| 0.9173611111111111 | 0 |
| 0.9180555555555556 | 0 |
| 0.9187500000000001 | 0 |
| 0.9194444444444444 | 0 |
| 0.9201388888888888 | 0 |
| 0.9208333333333334 | 0 |
| 0.9215277777777778 | 0 |
| 0.9222222222222222 | 0 |
| 0.9229166666666666 | 0 |
| 0.9236111111111112 | 0 |
| 0.9243055555555556 | 0 |
| 0.9249999999999999 | 0 |
| 0.9256944444444444 | 0 |
| 0.9263888888888889 | 0 |
| 0.9270833333333334 | 0 |
| 0.9277777777777777 | 0 |
| 0.9284722222222223 | 0 |
| 0.9291666666666667 | 0 |
| 0.9298611111111111 | 0 |
| 0.9305555555555555 | 0 |
| 0.93125 | 0 |
| 0.9319444444444445 | 0 |
| 0.9326388888888889 | 0 |
| 0.9333333333333332 | 0 |
| 0.9340277777777778 | 0 |
| 0.9347222222222222 | 0 |
| 0.9354166666666667 | 0 |
| 0.936111111111111 | 0 |
| 0.9368055555555556 | 0 |
| 0.9375 | 0 |
| 0.9381944444444444 | 0 |
| 0.938888888888889 | 0 |
| 0.9395833333333333 | 0 |
| 0.9402777777777778 | 0 |
| 0.9409722222222222 | 0 |
| 0.9416666666666668 | 0 |
| 0.9423611111111111 | 0 |
| 0.9430555555555555 | 0 |
| 0.94375 | 0 |
| 0.9444444444444445 | 0 |
| 0.9451388888888889 | 0 |
| 0.9458333333333333 | 0 |
| 0.9465277777777777 | 0 |
| 0.9472222222222223 | 0 |
| 0.9479166666666666 | 0 |
| 0.9486111111111111 | 0 |
| 0.9493055555555556 | 0 |
| 0.9500000000000001 | 0 |
| 0.9506944444444444 | 0 |
| 0.9513888888888888 | 0 |
| 0.9520833333333334 | 0 |
| 0.9527777777777778 | 0 |
| 0.9534722222222222 | 0 |
| 0.9541666666666666 | 0 |
| 0.9548611111111112 | 0 |
| 0.9555555555555556 | 0 |
| 0.9562499999999999 | 0 |
| 0.9569444444444444 | 0 |
| 0.9576388888888889 | 0 |
| 0.9583333333333334 | 0 |
| 0.9590277777777777 | 0 |
| 0.9597222222222223 | 0 |
| 0.9604166666666667 | 0 |
| 0.9611111111111111 | 0 |
| 0.9618055555555555 | 0 |
| 0.9625 | 0 |
| 0.9631944444444445 | 0 |
| 0.9638888888888889 | 0 |
| 0.9645833333333332 | 0 |
| 0.9652777777777778 | 0 |
| 0.9659722222222222 | 0 |
| 0.9666666666666667 | 0 |
| 0.967361111111111 | 0 |
| 0.9680555555555556 | 0 |
| 0.96875 | 0 |
| 0.9694444444444444 | 0 |
| 0.970138888888889 | 0 |
| 0.9708333333333333 | 0 |
| 0.9715277777777778 | 0 |
| 0.9722222222222222 | 0 |
| 0.9729166666666668 | 0 |
| 0.9736111111111111 | 0 |
| 0.9743055555555555 | 0 |
| 0.975 | 0 |
| 0.9756944444444445 | 0 |
| 0.9763888888888889 | 0 |
| 0.9770833333333333 | 0 |
| 0.9777777777777777 | 0 |
| 0.9784722222222223 | 0 |
| 0.9791666666666666 | 0 |
| 0.9798611111111111 | 0 |
| 0.9805555555555556 | 0 |
| 0.9812500000000001 | 0 |
| 0.9819444444444444 | 0 |
| 0.9826388888888888 | 0 |
| 0.9833333333333334 | 0 |
| 0.9840277777777778 | 0 |
| 0.9847222222222222 | 0 |
| 0.9854166666666666 | 0 |
| 0.9861111111111112 | 0 |
| 0.9868055555555556 | 0 |
| 0.9874999999999999 | 0 |
| 0.9881944444444444 | 0 |
| 0.9888888888888889 | 0 |
| 0.9895833333333334 | 0 |
| 0.9902777777777777 | 0 |
| 0.9909722222222223 | 0 |
| 0.9916666666666667 | 0 |
| 0.9923611111111111 | 0 |
| 0.9930555555555555 | 0 |
| 0.99375 | 0 |
| 0.9944444444444445 | 0 |
| 0.9951388888888889 | 0 |
| 0.9958333333333332 | 0 |
| 0.9965277777777778 | 0 |
| 0.9972222222222222 | 0 |
| 0.9979166666666667 | 0 |
| 0.998611111111111 | 0 |
| 0.9993055555555556 | 0 |